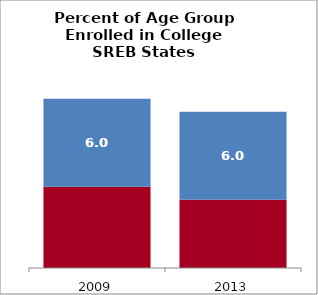
| Category | 18 to 24 | 25 to 49 |
|---|---|---|
| 2009.0 | 35.52 | 5.987 |
| 2013.0 | 34.632 | 5.984 |